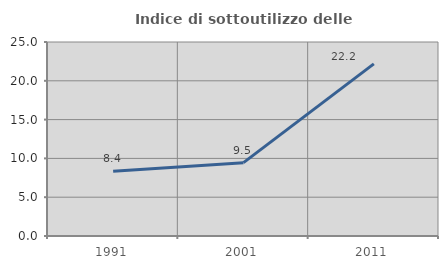
| Category | Indice di sottoutilizzo delle abitazioni  |
|---|---|
| 1991.0 | 8.359 |
| 2001.0 | 9.455 |
| 2011.0 | 22.187 |